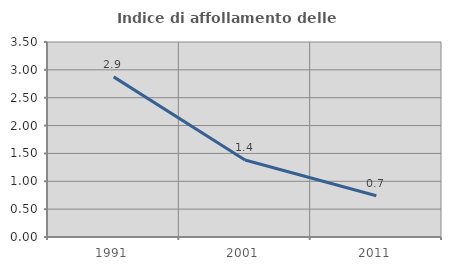
| Category | Indice di affollamento delle abitazioni  |
|---|---|
| 1991.0 | 2.874 |
| 2001.0 | 1.382 |
| 2011.0 | 0.74 |